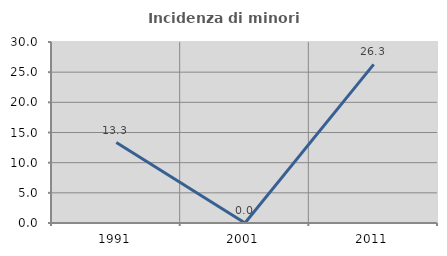
| Category | Incidenza di minori stranieri |
|---|---|
| 1991.0 | 13.333 |
| 2001.0 | 0 |
| 2011.0 | 26.286 |